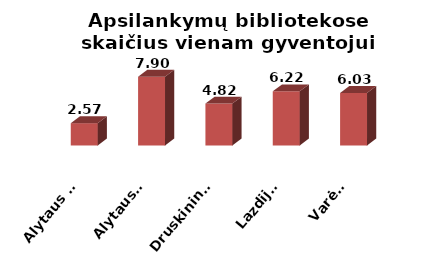
| Category | Series 0 |
|---|---|
| Alytaus m. | 2.568 |
| Alytaus r. | 7.897 |
| Druskininkai | 4.816 |
| Lazdijai | 6.222 |
| Varėna | 6.033 |